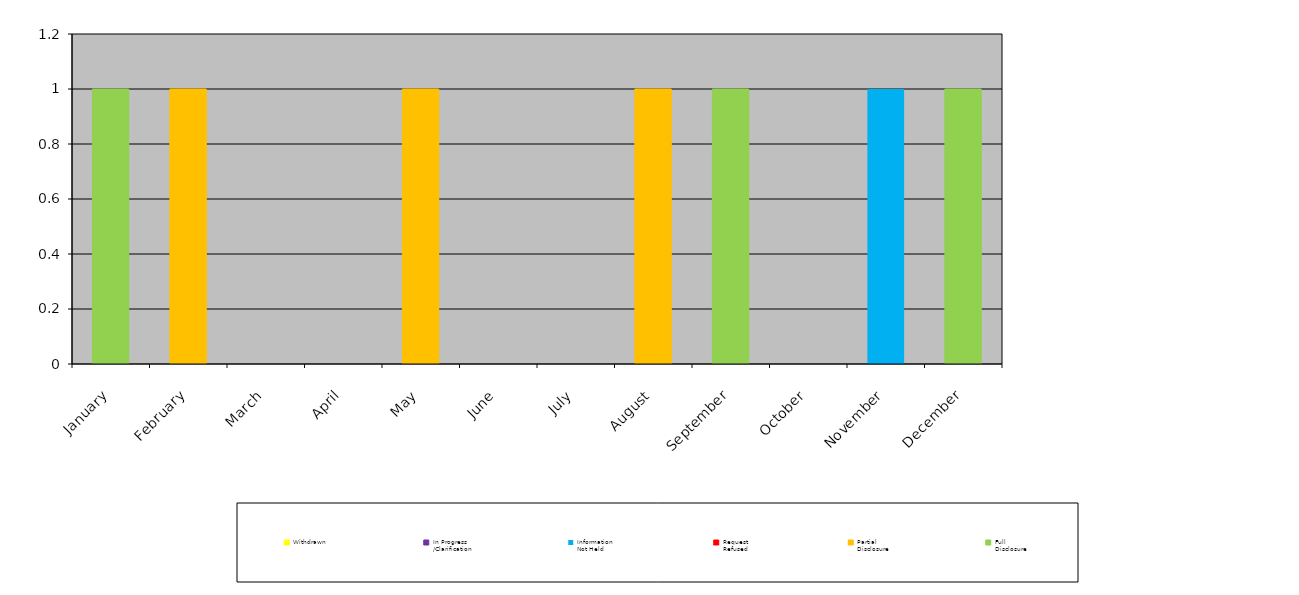
| Category | Withdrawn | In Progress
/Clarification | Information
Not Held | Request
Refused | Partial
Disclosure | Full
Disclosure |
|---|---|---|---|---|---|---|
| January | 0 | 0 | 0 | 0 | 0 | 1 |
| February | 0 | 0 | 0 | 0 | 1 | 0 |
| March | 0 | 0 | 0 | 0 | 0 | 0 |
| April | 0 | 0 | 0 | 0 | 0 | 0 |
| May | 0 | 0 | 0 | 0 | 1 | 0 |
| June | 0 | 0 | 0 | 0 | 0 | 0 |
| July | 0 | 0 | 0 | 0 | 0 | 0 |
| August | 0 | 0 | 0 | 0 | 1 | 0 |
| September | 0 | 0 | 0 | 0 | 0 | 1 |
| October | 0 | 0 | 0 | 0 | 0 | 0 |
| November | 0 | 0 | 1 | 0 | 0 | 0 |
| December | 0 | 0 | 0 | 0 | 0 | 1 |